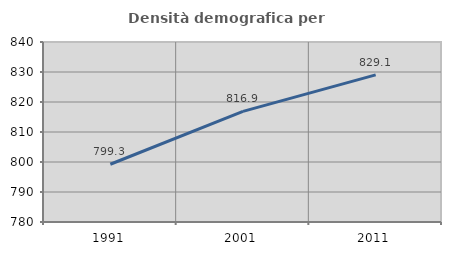
| Category | Densità demografica |
|---|---|
| 1991.0 | 799.255 |
| 2001.0 | 816.874 |
| 2011.0 | 829.058 |